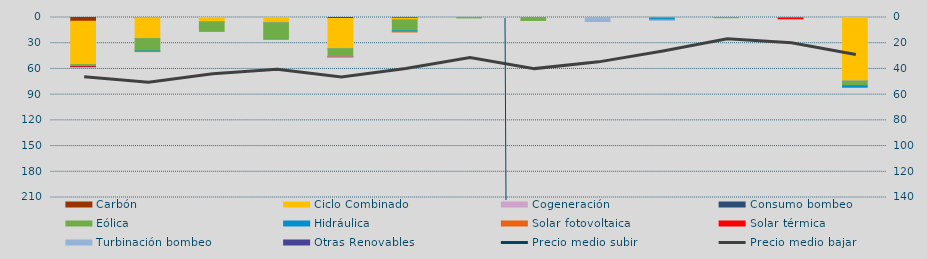
| Category | Carbón | Ciclo Combinado | Cogeneración | Consumo bombeo | Eólica | Hidráulica | Solar fotovoltaica | Solar térmica | Turbinación bombeo | Otras Renovables |
|---|---|---|---|---|---|---|---|---|---|---|
| 0 | 4394.5 | 50553 | 0 |  | 2251 | 0 | 33.2 | 196 | 0 | 467 |
| 1 | 167 | 24469.7 | 4.5 |  | 14472.2 | 627.8 | 21.8 | 0 | 0 | 0 |
| 2 | 0 | 4989.5 | 0 |  | 11218.3 | 8.9 | 0 | 0 | 0 | 0 |
| 3 | 0 | 5246.6 | 891.5 |  | 19357.7 | 73 | 0 | 0 | 0 | 0 |
| 4 | 1161 | 34847 | 340.9 |  | 9473.4 | 120 | 21.4 | 39.8 | 400 | 0 |
| 5 | 846 | 1898.8 | 0 |  | 12932.4 | 1173 | 33 | 0 | 0 | 80 |
| 6 | 0 | 0 | 0 |  | 464.6 | 0 | 0 | 0 | 0 | 0 |
| 7 | 0 | 0 | 0 |  | 3444.7 | 0 | 0 | 0 | 0 | 0 |
| 8 | 0 | 0 | 0 |  | 0 | 0 | 0 | 0 | 4657.9 | 0 |
| 9 | 0 | 0 | 0 |  | 1293.6 | 1910.2 | 0 | 0 | 100 | 0 |
| 10 | 0 | 0 | 0 |  | 227.5 | 0 | 0 | 0 | 0 | 0 |
| 11 | 0 | 0 | 0 |  | 0 | 946.5 | 61.6 | 516 | 0 | 0 |
| 12 | 0 | 73835.8 | 271.4 |  | 5567.4 | 2850.8 | 0 | 0 | 0 | 0 |